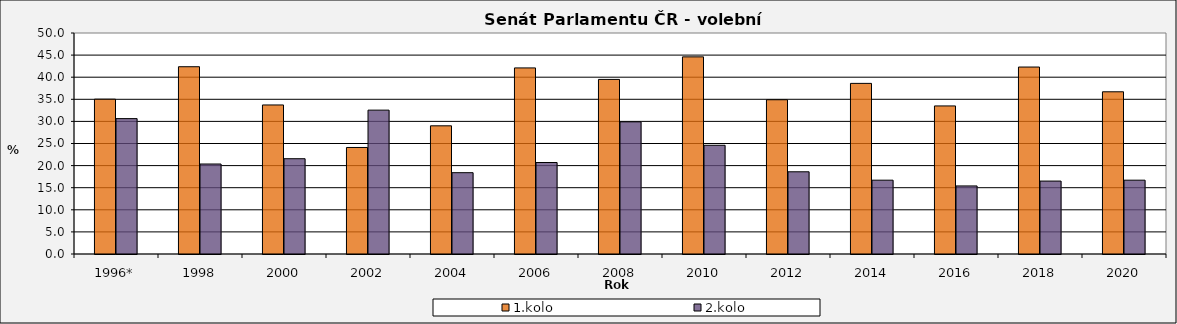
| Category | 1.kolo | 2.kolo |
|---|---|---|
| 1996* | 35.03 | 30.63 |
| 1998 | 42.37 | 20.36 |
| 2000 | 33.72 | 21.56 |
| 2002 | 24.1 | 32.55 |
| 2004 | 29 | 18.4 |
| 2006 | 42.1 | 20.7 |
| 2008 | 39.5 | 29.9 |
| 2010 | 44.6 | 24.6 |
| 2012 | 34.9 | 18.6 |
| 2014 | 38.6 | 16.7 |
| 2016 | 33.5 | 15.4 |
| 2018 | 42.3 | 16.5 |
| 2020 | 36.7 | 16.7 |